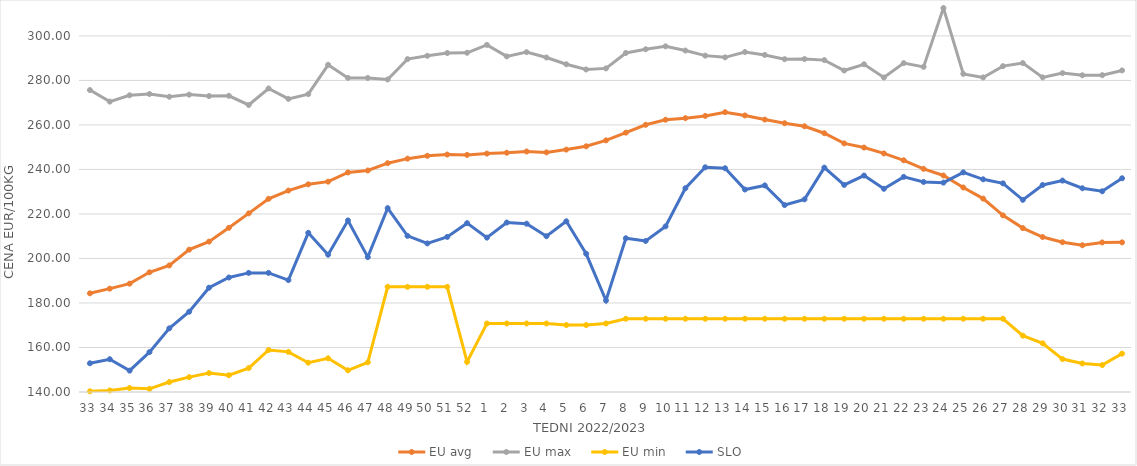
| Category | EU avg | EU max | EU min | SLO |
|---|---|---|---|---|
| 33.0 | 184.343 | 275.68 | 140.33 | 152.91 |
| 34.0 | 186.448 | 270.49 | 140.7 | 154.73 |
| 35.0 | 188.684 | 273.33 | 141.78 | 149.6 |
| 36.0 | 193.792 | 273.91 | 141.41 | 157.93 |
| 37.0 | 196.877 | 272.67 | 144.47 | 168.61 |
| 38.0 | 203.962 | 273.63 | 146.68 | 176.07 |
| 39.0 | 207.574 | 272.98 | 148.499 | 186.86 |
| 40.0 | 213.785 | 273.1 | 147.54 | 191.45 |
| 41.0 | 220.272 | 268.98 | 150.75 | 193.52 |
| 42.0 | 226.803 | 276.39 | 158.87 | 193.52 |
| 43.0 | 230.521 | 271.72 | 158.04 | 190.28 |
| 44.0 | 233.325 | 273.856 | 153.16 | 211.53 |
| 45.0 | 234.517 | 287.021 | 155.13 | 201.69 |
| 46.0 | 238.669 | 281.133 | 149.75 | 217.08 |
| 47.0 | 239.534 | 281.102 | 153.36 | 200.62 |
| 48.0 | 242.81 | 280.434 | 187.26 | 222.61 |
| 49.0 | 244.854 | 289.585 | 187.26 | 210.16 |
| 50.0 | 246.132 | 291.057 | 187.26 | 206.76 |
| 51.0 | 246.705 | 292.307 | 187.26 | 209.69 |
| 52.0 | 246.546 | 292.426 | 153.54 | 215.87 |
| 1.0 | 247.118 | 295.98 | 170.79 | 209.37 |
| 2.0 | 247.516 | 290.8 | 170.79 | 216.15 |
| 3.0 | 248.079 | 292.71 | 170.79 | 215.63 |
| 4.0 | 247.672 | 290.32 | 170.79 | 210 |
| 5.0 | 248.924 | 287.27 | 170.09 | 216.7 |
| 6.0 | 250.4 | 284.92 | 170.09 | 202.1 |
| 7.0 | 253.074 | 285.42 | 170.79 | 181.11 |
| 8.0 | 256.543 | 292.35 | 172.91 | 209.08 |
| 9.0 | 260.066 | 294.02 | 172.91 | 207.87 |
| 10.0 | 262.352 | 295.33 | 172.91 | 214.42 |
| 11.0 | 263.049 | 293.44 | 172.91 | 231.56 |
| 12.0 | 264.068 | 291.15 | 172.91 | 240.97 |
| 13.0 | 265.73 | 290.38 | 172.91 | 240.55 |
| 14.0 | 264.262 | 292.763 | 172.91 | 230.99 |
| 15.0 | 262.411 | 291.46 | 172.91 | 232.82 |
| 16.0 | 260.77 | 289.56 | 172.91 | 224 |
| 17.0 | 259.395 | 289.61 | 172.91 | 226.57 |
| 18.0 | 256.275 | 289.13 | 172.91 | 240.83 |
| 19.0 | 251.716 | 284.45 | 172.91 | 233.05 |
| 20.0 | 249.836 | 287.26 | 172.91 | 237.25 |
| 21.0 | 247.212 | 281.33 | 172.91 | 231.3 |
| 22.0 | 244.103 | 287.77 | 172.91 | 236.67 |
| 23.0 | 240.279 | 286.1 | 172.91 | 234.39 |
| 24.0 | 237.289 | 312.54 | 172.91 | 234.08 |
| 25.0 | 231.895 | 282.95 | 172.91 | 238.69 |
| 26.0 | 226.903 | 281.34 | 172.91 | 235.57 |
| 27.0 | 219.368 | 286.43 | 172.91 | 233.75 |
| 28.0 | 213.659 | 287.8 | 165.32 | 226.35 |
| 29.0 | 209.648 | 281.37 | 161.87 | 233.03 |
| 30.0 | 207.297 | 283.3 | 154.8 | 235 |
| 31.0 | 205.939 | 282.32 | 152.83 | 231.55 |
| 32.0 | 207.193 | 282.36 | 152.1 | 230.2 |
| 33.0 | 207.238 | 284.5 | 157.23 | 236.04 |